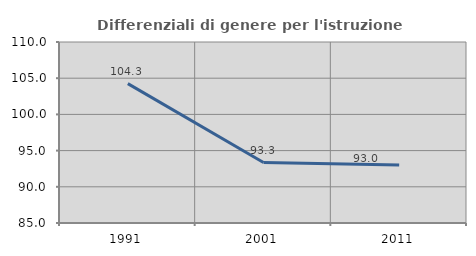
| Category | Differenziali di genere per l'istruzione superiore |
|---|---|
| 1991.0 | 104.256 |
| 2001.0 | 93.349 |
| 2011.0 | 93.008 |